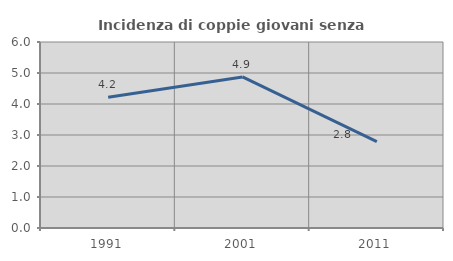
| Category | Incidenza di coppie giovani senza figli |
|---|---|
| 1991.0 | 4.215 |
| 2001.0 | 4.872 |
| 2011.0 | 2.784 |